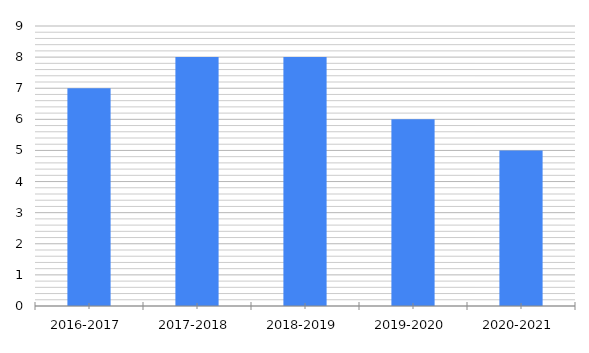
| Category | Кол-во проведенных мероприятий для жителей города, области и др регионов (детские курсы, праздничные мероприятия) |
|---|---|
| 2016-2017 | 7 |
| 2017-2018 | 8 |
| 2018-2019 | 8 |
| 2019-2020 | 6 |
| 2020-2021 | 5 |